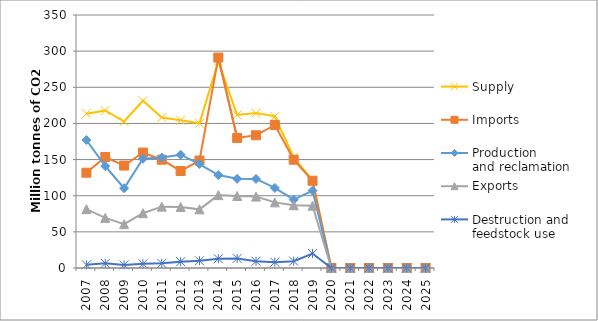
| Category | Supply | Imports | Production 
and reclamation | Exports | Destruction and 
feedstock use |
|---|---|---|---|---|---|
| 2007.0 | 213.517 | 131.82 | 177.053 | 81.362 | 4.408 |
| 2008.0 | 217.95 | 153.58 | 140.951 | 69.331 | 6.481 |
| 2009.0 | 202.629 | 141.701 | 110.384 | 60.613 | 4.252 |
| 2010.0 | 231.343 | 159.734 | 151.106 | 75.831 | 5.835 |
| 2011.0 | 208.157 | 149.742 | 152.91 | 84.867 | 6.464 |
| 2012.0 | 204.34 | 134.223 | 156.749 | 84.387 | 8.724 |
| 2013.0 | 200.118 | 148.676 | 143.843 | 81.127 | 9.994 |
| 2014.0 | 285.793 | 291.128 | 128.527 | 100.815 | 12.78 |
| 2015.0 | 211.636 | 179.908 | 123.353 | 99.631 | 13.224 |
| 2016.0 | 214.324 | 183.61 | 123.19 | 98.78 | 9.308 |
| 2017.0 | 209.775 | 197.848 | 110.796 | 90.798 | 8.076 |
| 2018.0 | 152.815 | 149.796 | 94.566 | 86.829 | 9.494 |
| 2019.0 | 121.514 | 120.703 | 107.037 | 86.115 | 19.981 |
| 2020.0 | 0 | 0 | 0 | 0 | 0 |
| 2021.0 | 0 | 0 | 0 | 0 | 0 |
| 2022.0 | 0 | 0 | 0 | 0 | 0 |
| 2023.0 | 0 | 0 | 0 | 0 | 0 |
| 2024.0 | 0 | 0 | 0 | 0 | 0 |
| 2025.0 | 0 | 0 | 0 | 0 | 0 |